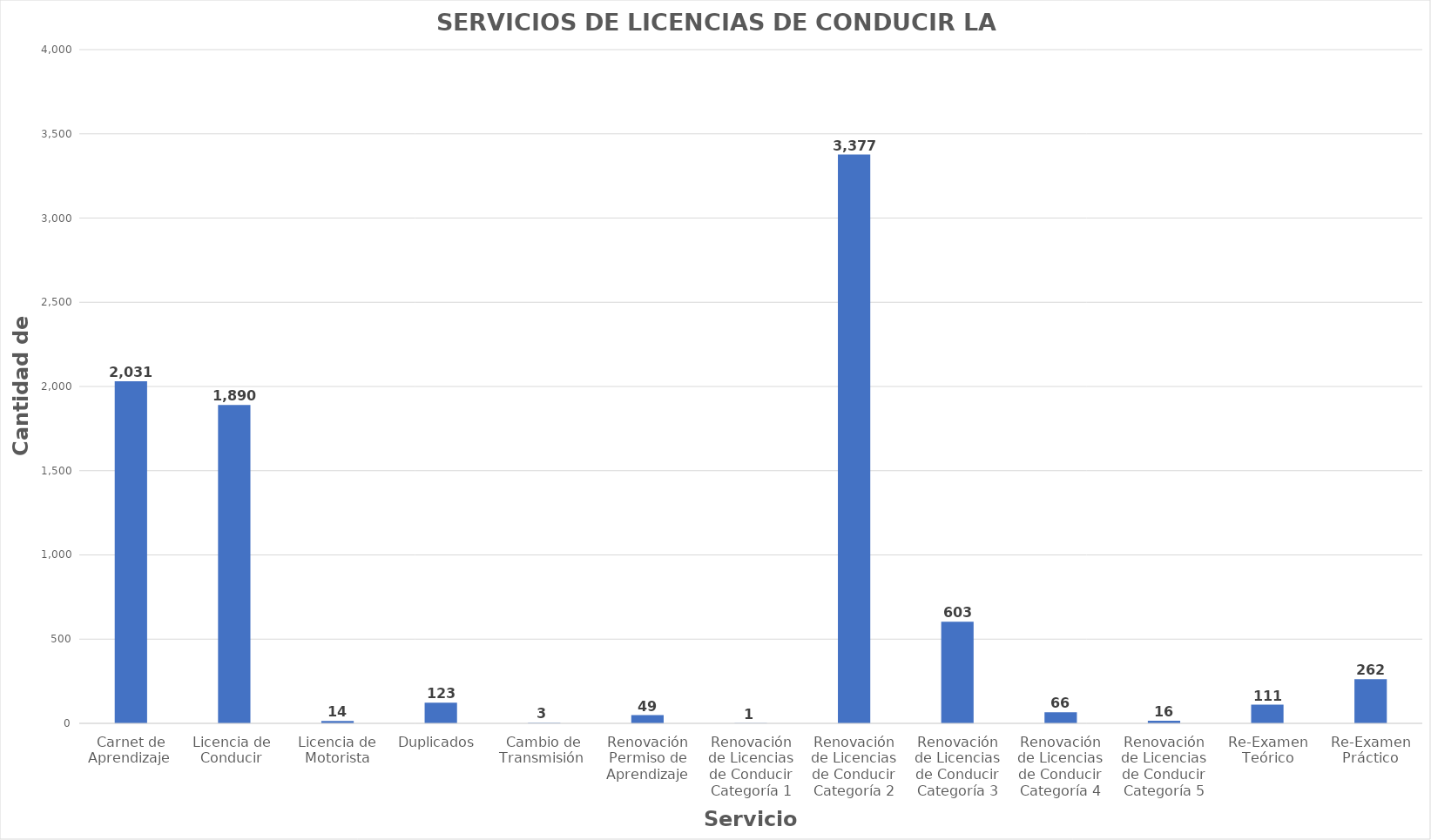
| Category | Series 0 |
|---|---|
| Carnet de Aprendizaje  | 2031 |
| Licencia de  Conducir  | 1890 |
| Licencia de Motorista | 14 |
| Duplicados  | 123 |
| Cambio de Transmisión  | 3 |
| Renovación Permiso de Aprendizaje | 49 |
| Renovación de Licencias de Conducir Categoría 1 | 1 |
| Renovación de Licencias de Conducir Categoría 2 | 3377 |
| Renovación de Licencias de Conducir Categoría 3 | 603 |
| Renovación de Licencias de Conducir Categoría 4 | 66 |
| Renovación de Licencias de Conducir Categoría 5 | 16 |
| Re-Examen Teórico | 111 |
| Re-Examen Práctico | 262 |